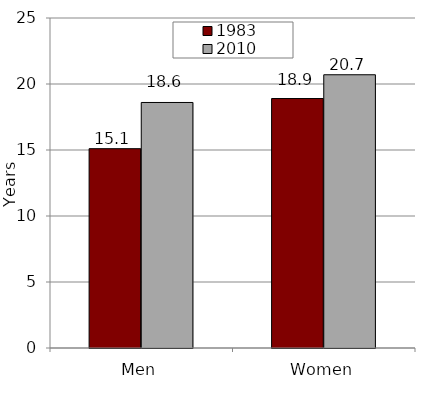
| Category | 1983 | 2010 |
|---|---|---|
| Men | 15.1 | 18.6 |
| Women | 18.9 | 20.7 |